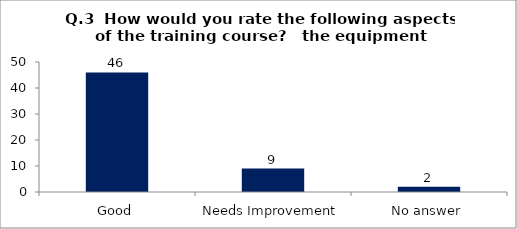
| Category | Q.3  How would you rate the following aspects of the training course?  |
|---|---|
| Good | 46 |
| Needs Improvement | 9 |
| No answer | 2 |